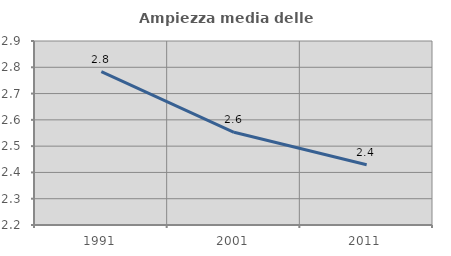
| Category | Ampiezza media delle famiglie |
|---|---|
| 1991.0 | 2.784 |
| 2001.0 | 2.553 |
| 2011.0 | 2.429 |